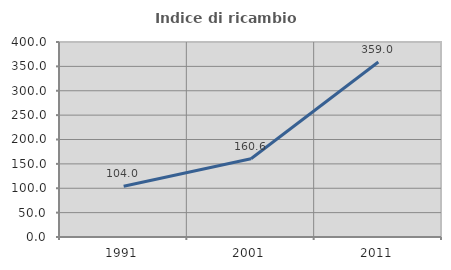
| Category | Indice di ricambio occupazionale  |
|---|---|
| 1991.0 | 103.965 |
| 2001.0 | 160.596 |
| 2011.0 | 359.016 |